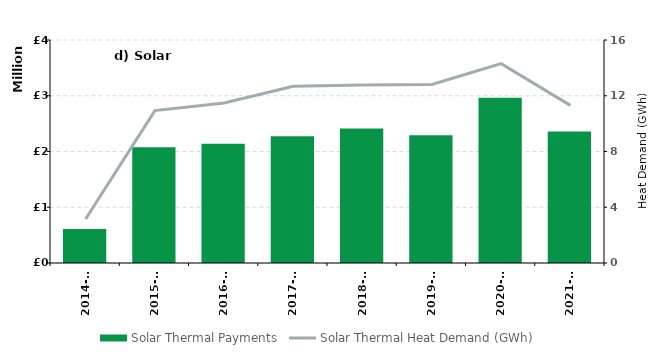
| Category | Solar Thermal Payments |
|---|---|
| 2014-15 | 609568.47 |
| 2015-16 | 2077266.8 |
| 2016-17 | 2136871.26 |
| 2017-18 | 2272018.29 |
| 2018-19 | 2412502.64 |
| 2019-20 | 2290106.47 |
| 2020-21 | 2965477.23 |
| 2021-22 | 2358281.05 |